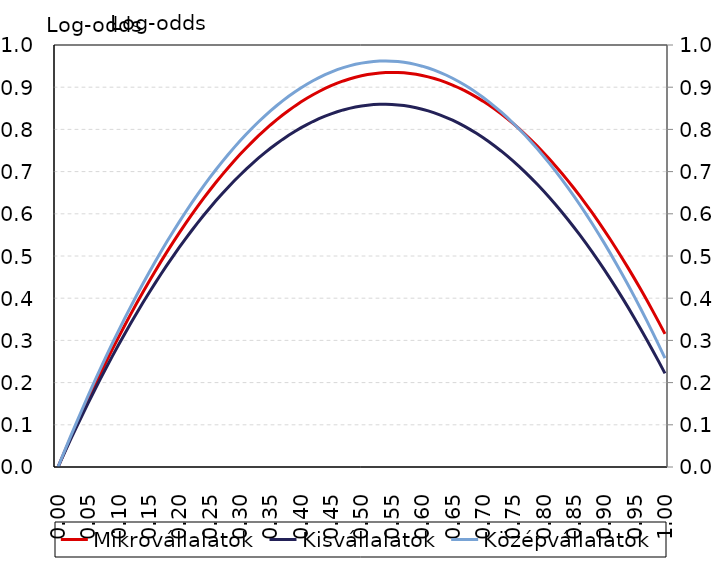
| Category | Mikrovállalatok | Kisvállalatok |
|---|---|---|
| 0.0 | 0 | 0 |
| 0.01 | 0.034 | 0.032 |
| 0.02 | 0.067 | 0.063 |
| 0.03 | 0.099 | 0.093 |
| 0.04 | 0.131 | 0.123 |
| 0.05 | 0.162 | 0.153 |
| 0.0600000000000001 | 0.192 | 0.181 |
| 0.0700000000000001 | 0.222 | 0.209 |
| 0.0800000000000001 | 0.252 | 0.237 |
| 0.0900000000000001 | 0.28 | 0.264 |
| 0.1 | 0.308 | 0.29 |
| 0.11 | 0.336 | 0.316 |
| 0.12 | 0.363 | 0.341 |
| 0.13 | 0.389 | 0.366 |
| 0.14 | 0.415 | 0.39 |
| 0.15 | 0.44 | 0.413 |
| 0.16 | 0.464 | 0.436 |
| 0.17 | 0.488 | 0.458 |
| 0.18 | 0.511 | 0.48 |
| 0.19 | 0.534 | 0.501 |
| 0.2 | 0.555 | 0.521 |
| 0.21 | 0.577 | 0.541 |
| 0.22 | 0.597 | 0.56 |
| 0.23 | 0.618 | 0.578 |
| 0.24 | 0.637 | 0.596 |
| 0.25 | 0.656 | 0.614 |
| 0.26 | 0.674 | 0.631 |
| 0.27 | 0.692 | 0.647 |
| 0.28 | 0.709 | 0.663 |
| 0.29 | 0.725 | 0.678 |
| 0.3 | 0.741 | 0.692 |
| 0.31 | 0.756 | 0.706 |
| 0.32 | 0.771 | 0.719 |
| 0.33 | 0.784 | 0.732 |
| 0.34 | 0.798 | 0.744 |
| 0.35 | 0.81 | 0.755 |
| 0.36 | 0.823 | 0.766 |
| 0.37 | 0.834 | 0.776 |
| 0.38 | 0.845 | 0.786 |
| 0.39 | 0.855 | 0.795 |
| 0.4 | 0.865 | 0.804 |
| 0.41 | 0.874 | 0.811 |
| 0.42 | 0.882 | 0.819 |
| 0.43 | 0.89 | 0.825 |
| 0.44 | 0.897 | 0.831 |
| 0.45 | 0.904 | 0.837 |
| 0.46 | 0.909 | 0.842 |
| 0.47 | 0.915 | 0.846 |
| 0.48 | 0.919 | 0.85 |
| 0.49 | 0.924 | 0.853 |
| 0.5 | 0.927 | 0.855 |
| 0.51 | 0.93 | 0.857 |
| 0.52 | 0.932 | 0.859 |
| 0.53 | 0.934 | 0.859 |
| 0.54 | 0.935 | 0.86 |
| 0.55 | 0.935 | 0.859 |
| 0.56 | 0.935 | 0.858 |
| 0.57 | 0.934 | 0.856 |
| 0.58 | 0.933 | 0.854 |
| 0.59 | 0.93 | 0.851 |
| 0.6 | 0.928 | 0.848 |
| 0.61 | 0.924 | 0.844 |
| 0.62 | 0.921 | 0.839 |
| 0.63 | 0.916 | 0.834 |
| 0.64 | 0.911 | 0.828 |
| 0.65 | 0.905 | 0.822 |
| 0.66 | 0.899 | 0.815 |
| 0.67 | 0.892 | 0.807 |
| 0.68 | 0.884 | 0.799 |
| 0.69 | 0.876 | 0.79 |
| 0.7 | 0.867 | 0.781 |
| 0.71 | 0.858 | 0.771 |
| 0.72 | 0.847 | 0.76 |
| 0.73 | 0.837 | 0.749 |
| 0.74 | 0.825 | 0.737 |
| 0.75 | 0.814 | 0.725 |
| 0.76 | 0.801 | 0.712 |
| 0.77 | 0.788 | 0.698 |
| 0.78 | 0.774 | 0.684 |
| 0.79 | 0.76 | 0.669 |
| 0.8 | 0.745 | 0.654 |
| 0.81 | 0.729 | 0.638 |
| 0.82 | 0.713 | 0.621 |
| 0.83 | 0.696 | 0.604 |
| 0.84 | 0.679 | 0.587 |
| 0.85 | 0.66 | 0.568 |
| 0.86 | 0.642 | 0.549 |
| 0.87 | 0.622 | 0.53 |
| 0.88 | 0.603 | 0.51 |
| 0.89 | 0.582 | 0.489 |
| 0.9 | 0.561 | 0.468 |
| 0.91 | 0.539 | 0.446 |
| 0.92 | 0.517 | 0.423 |
| 0.93 | 0.494 | 0.4 |
| 0.94 | 0.47 | 0.376 |
| 0.95 | 0.446 | 0.352 |
| 0.96 | 0.421 | 0.327 |
| 0.97 | 0.395 | 0.302 |
| 0.98 | 0.369 | 0.276 |
| 0.99 | 0.343 | 0.249 |
| 1.0 | 0.315 | 0.222 |